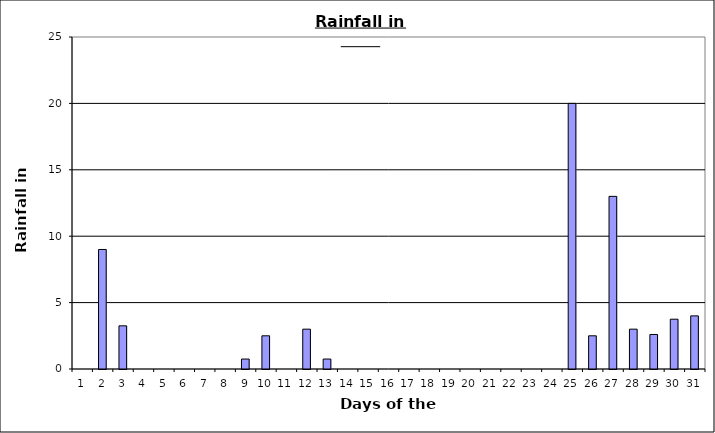
| Category | Series 0 |
|---|---|
| 0 | 0 |
| 1 | 9 |
| 2 | 3.25 |
| 3 | 0 |
| 4 | 0 |
| 5 | 0 |
| 6 | 0 |
| 7 | 0 |
| 8 | 0.75 |
| 9 | 2.5 |
| 10 | 0 |
| 11 | 3 |
| 12 | 0.75 |
| 13 | 0 |
| 14 | 0 |
| 15 | 0 |
| 16 | 0 |
| 17 | 0 |
| 18 | 0 |
| 19 | 0 |
| 20 | 0 |
| 21 | 0 |
| 22 | 0 |
| 23 | 0 |
| 24 | 20 |
| 25 | 2.5 |
| 26 | 13 |
| 27 | 3 |
| 28 | 2.6 |
| 29 | 3.75 |
| 30 | 4 |